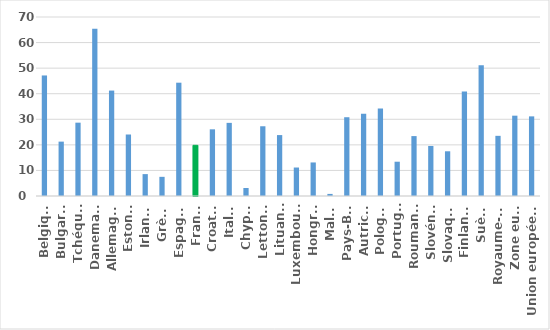
| Category | Series 0 |
|---|---|
| Belgique | 47.137 |
| Bulgarie | 21.264 |
| Tchéquie | 28.676 |
| Danemark | 65.37 |
| Allemagne | 41.23 |
| Estonie | 24.051 |
| Irlande | 8.56 |
| Grèce | 7.495 |
| Espagne | 44.31 |
| France | 19.821 |
| Croatie | 26.078 |
| Italie | 28.601 |
| Chypre | 3.132 |
| Lettonie | 27.273 |
| Lituanie | 23.824 |
| Luxembourg | 11.137 |
| Hongrie | 13.118 |
| Malte | 0.815 |
| Pays-Bas | 30.806 |
| Autriche | 32.165 |
| Pologne | 34.217 |
| Portugal | 13.409 |
| Roumanie | 23.429 |
| Slovénie | 19.575 |
| Slovaquie | 17.488 |
| Finlande | 40.866 |
| Suède | 51.102 |
| Royaume-Uni | 23.529 |
| Zone euro | 31.41 |
| Union européenne | 31.14 |